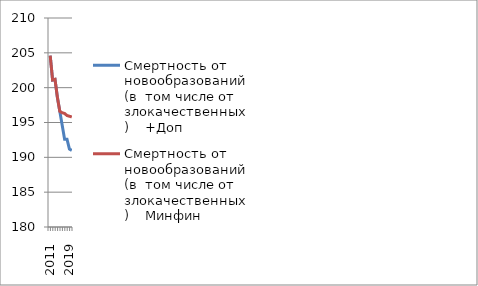
| Category | Смертность от новообразований (в  том числе от злокачественных)    +Доп | Смертность от новообразований (в  том числе от злокачественных)    Минфин |
|---|---|---|
| 2011.0 | 204.6 | 204.6 |
| 2012.0 | 201.1 | 201.1 |
| 2013.0 | 201.2 | 201.2 |
| 2014.0 | 198.6 | 198.6 |
| 2015.0 | 196.6 | 196.6 |
| 2016.0 | 194.6 | 196.4 |
| 2017.0 | 192.6 | 196.3 |
| 2018.0 | 192.6 | 196 |
| 2019.0 | 191.2 | 195.9 |
| 2020.0 | 191 | 195.8 |